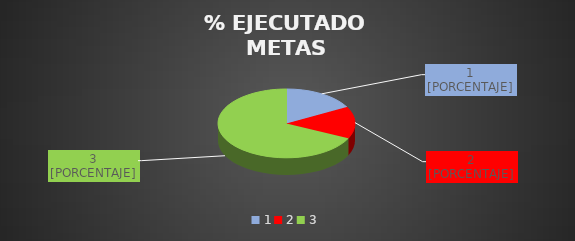
| Category | Series 0 | Series 1 |
|---|---|---|
| 0 | 0.171 |  |
| 1 | 0.15 |  |
| 2 | 0.679 |  |